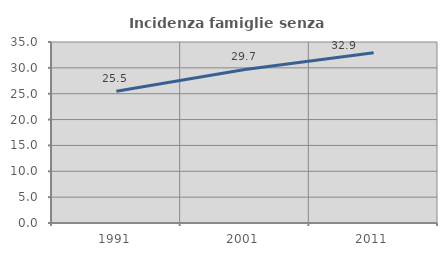
| Category | Incidenza famiglie senza nuclei |
|---|---|
| 1991.0 | 25.479 |
| 2001.0 | 29.698 |
| 2011.0 | 32.929 |